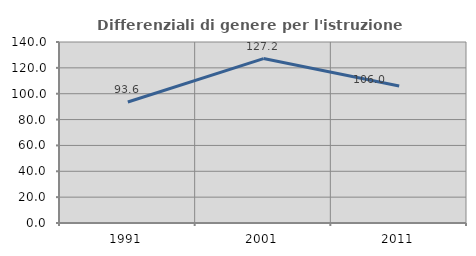
| Category | Differenziali di genere per l'istruzione superiore |
|---|---|
| 1991.0 | 93.581 |
| 2001.0 | 127.191 |
| 2011.0 | 105.965 |